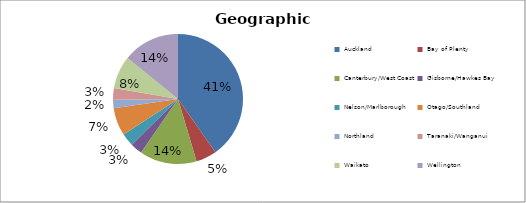
| Category | Series 0 |
|---|---|
| Auckland | 0.402 |
| Bay of Plenty | 0.052 |
| Canterbury/West Coast | 0.142 |
| Gisborne/Hawkes Bay | 0.03 |
| Nelson/Marlborough | 0.032 |
| Otago/Southland | 0.069 |
| Northland | 0.021 |
| Taranaki/Wanganui | 0.028 |
| Waikato | 0.082 |
| Wellington | 0.142 |